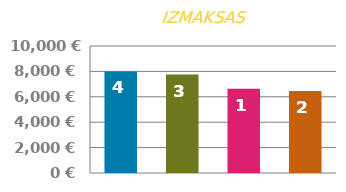
| Category | UZREIZ |
|---|---|
| 0 | 8000 |
| 1 | 7750 |
| 2 | 6625 |
| 3 | 6450 |